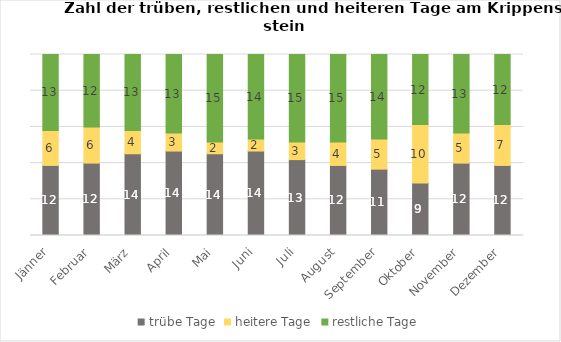
| Category | trübe Tage | heitere Tage | restliche Tage |
|---|---|---|---|
| Jänner | 12 | 6 | 13 |
| Februar | 12 | 6 | 12 |
| März | 14 | 4 | 13 |
| April | 14 | 3 | 13 |
| Mai | 14 | 2 | 15 |
| Juni | 14 | 2 | 14 |
| Juli | 13 | 3 | 15 |
| August | 12 | 4 | 15 |
| September | 11 | 5 | 14 |
| Oktober | 9 | 10 | 12 |
| November | 12 | 5 | 13 |
| Dezember | 12 | 7 | 12 |